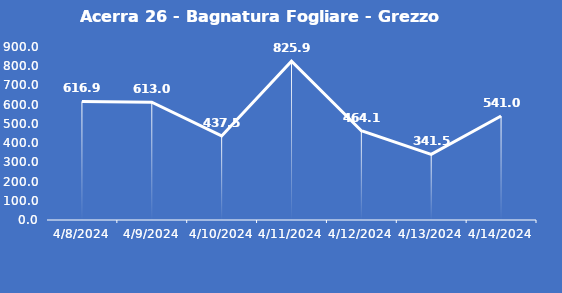
| Category | Acerra 26 - Bagnatura Fogliare - Grezzo (min) |
|---|---|
| 4/8/24 | 616.9 |
| 4/9/24 | 613 |
| 4/10/24 | 437.5 |
| 4/11/24 | 825.9 |
| 4/12/24 | 464.1 |
| 4/13/24 | 341.5 |
| 4/14/24 | 541 |